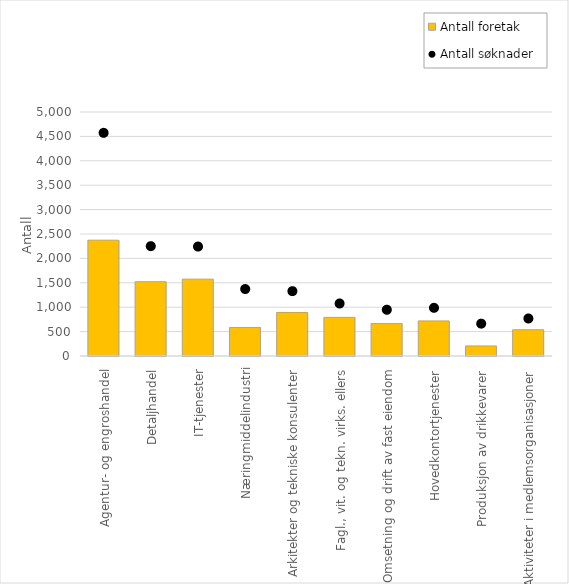
| Category | Antall foretak  |
|---|---|
| Agentur- og engroshandel | 2373 |
| Detaljhandel | 1522 |
| IT-tjenester | 1575 |
| Næringmiddelindustri | 585 |
| Arkitekter og tekniske konsulenter | 892 |
| Fagl., vit. og tekn. virks. ellers | 792 |
| Omsetning og drift av fast eiendom | 665 |
| Hovedkontortjenester | 719 |
| Produksjon av drikkevarer | 206 |
| Aktiviteter i medlemsorganisasjoner | 538 |